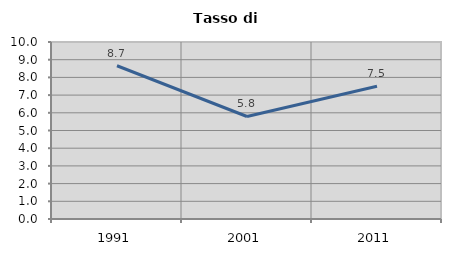
| Category | Tasso di disoccupazione   |
|---|---|
| 1991.0 | 8.657 |
| 2001.0 | 5.792 |
| 2011.0 | 7.5 |